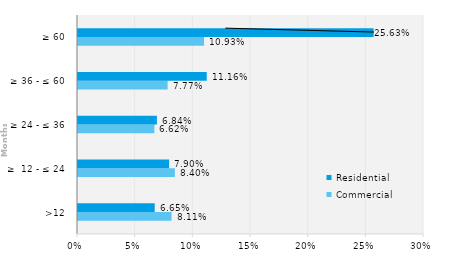
| Category | Commercial | Residential |
|---|---|---|
| >12 | 0.081 | 0.066 |
| ≥  12 - ≤ 24 | 0.084 | 0.079 |
| ≥ 24 - ≤ 36 | 0.066 | 0.068 |
| ≥ 36 - ≤ 60 | 0.078 | 0.112 |
| ≥ 60 | 0.109 | 0.256 |